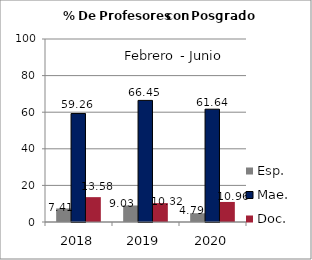
| Category | Esp. | Mae. | Doc. |
|---|---|---|---|
| 2018.0 | 7.41 | 59.26 | 13.58 |
| 2019.0 | 9.03 | 66.45 | 10.32 |
| 2020.0 | 4.79 | 61.64 | 10.96 |